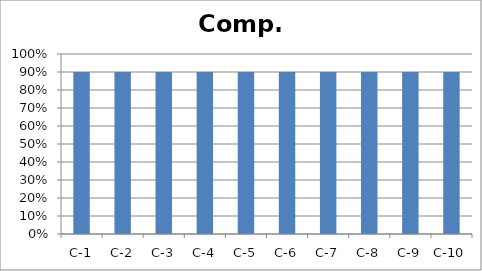
| Category | Comp. |
|---|---|
| C-1 | 0.9 |
| C-2 | 0.9 |
| C-3 | 0.9 |
| C-4 | 0.9 |
| C-5 | 0.9 |
| C-6 | 0.9 |
| C-7 | 0.9 |
| C-8 | 0.9 |
| C-9 | 0.9 |
| C-10 | 0.9 |